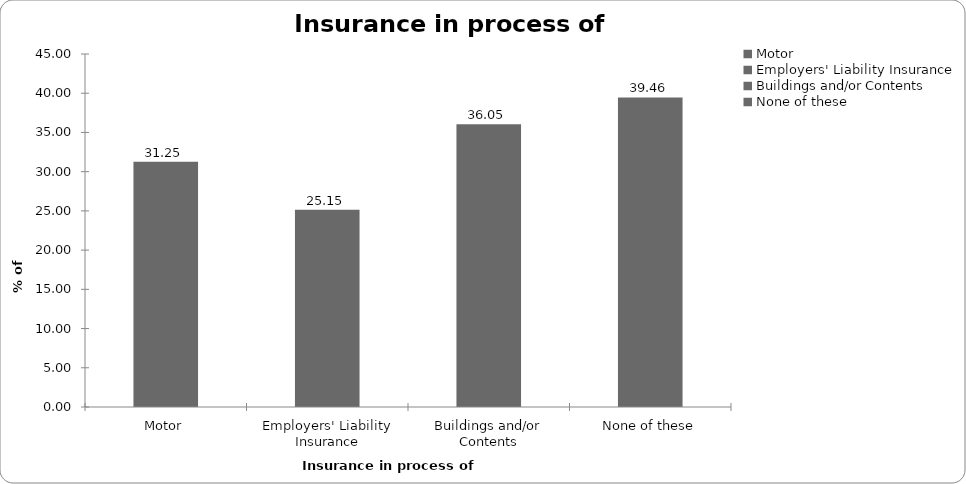
| Category | Insurance in process of buying |
|---|---|
| Motor | 31.254 |
| Employers' Liability Insurance | 25.148 |
| Buildings and/or Contents | 36.047 |
| None of these | 39.462 |